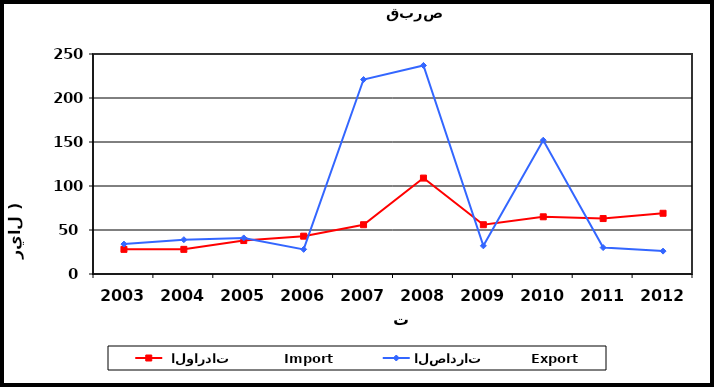
| Category |  الواردات           Import | الصادرات          Export |
|---|---|---|
| 2003.0 | 28 | 34 |
| 2004.0 | 28 | 39 |
| 2005.0 | 38 | 41 |
| 2006.0 | 43 | 28 |
| 2007.0 | 56 | 221 |
| 2008.0 | 109 | 237 |
| 2009.0 | 56 | 32 |
| 2010.0 | 65 | 152 |
| 2011.0 | 63 | 30 |
| 2012.0 | 69 | 26 |